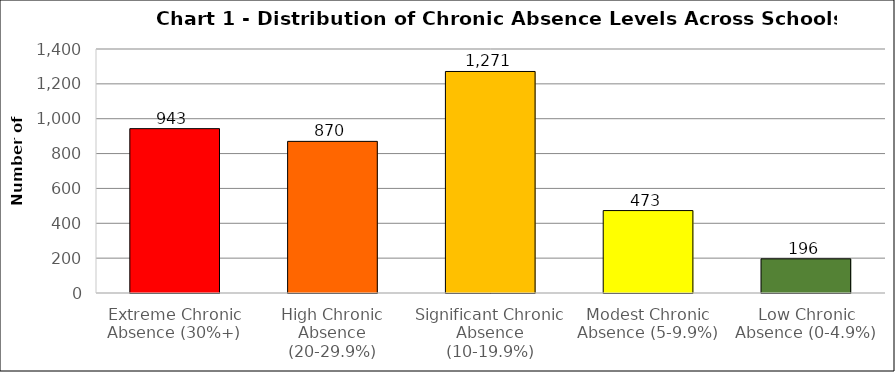
| Category | Series 0 |
|---|---|
| Extreme Chronic Absence (30%+) | 943 |
| High Chronic Absence (20-29.9%) | 870 |
| Significant Chronic Absence (10-19.9%) | 1271 |
| Modest Chronic Absence (5-9.9%) | 473 |
| Low Chronic Absence (0-4.9%) | 196 |